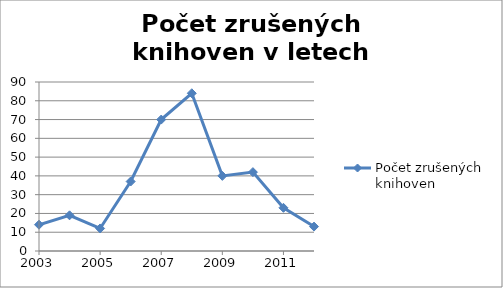
| Category | Počet zrušených knihoven |
|---|---|
| 2003.0 | 14 |
| 2004.0 | 19 |
| 2005.0 | 12 |
| 2006.0 | 37 |
| 2007.0 | 70 |
| 2008.0 | 84 |
| 2009.0 | 40 |
| 2010.0 | 42 |
| 2011.0 | 23 |
| 2012.0 | 13 |